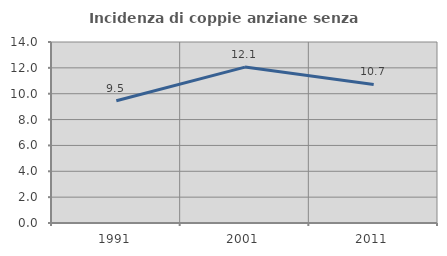
| Category | Incidenza di coppie anziane senza figli  |
|---|---|
| 1991.0 | 9.453 |
| 2001.0 | 12.06 |
| 2011.0 | 10.714 |